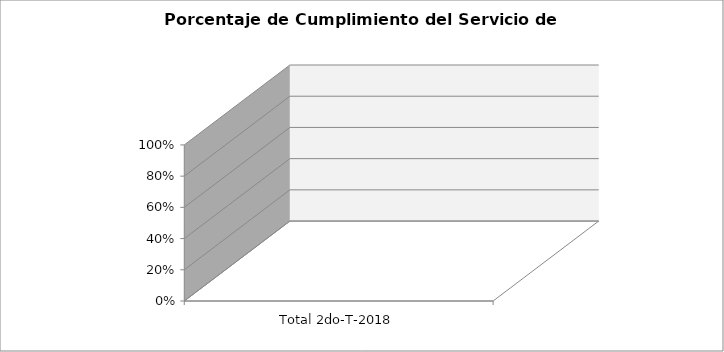
| Category | Total 2do-T-2018 |
|---|---|
| Total 2do-T-2018 | 0 |